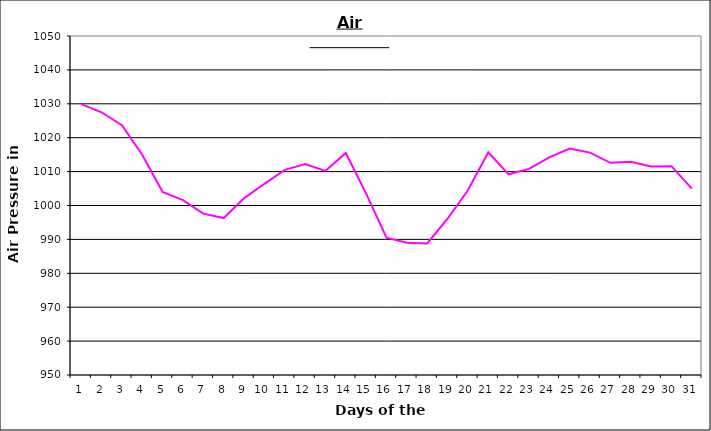
| Category | Series 0 |
|---|---|
| 0 | 1029.9 |
| 1 | 1027.5 |
| 2 | 1023.7 |
| 3 | 1015 |
| 4 | 1004 |
| 5 | 1001.6 |
| 6 | 997.6 |
| 7 | 996.3 |
| 8 | 1002.1 |
| 9 | 1006.4 |
| 10 | 1010.5 |
| 11 | 1012.2 |
| 12 | 1010.2 |
| 13 | 1015.5 |
| 14 | 1003.5 |
| 15 | 990.5 |
| 16 | 989 |
| 17 | 988.8 |
| 18 | 996.1 |
| 19 | 1004.5 |
| 20 | 1015.7 |
| 21 | 1009.2 |
| 22 | 1010.8 |
| 23 | 1014.2 |
| 24 | 1016.8 |
| 25 | 1015.6 |
| 26 | 1012.6 |
| 27 | 1012.9 |
| 28 | 1011.5 |
| 29 | 1011.6 |
| 30 | 1005 |